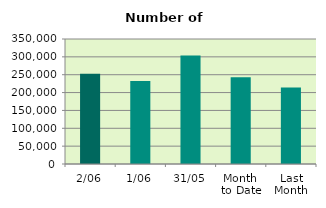
| Category | Series 0 |
|---|---|
| 2/06 | 252854 |
| 1/06 | 232682 |
| 31/05 | 303858 |
| Month 
to Date | 242768 |
| Last
Month | 214383.182 |